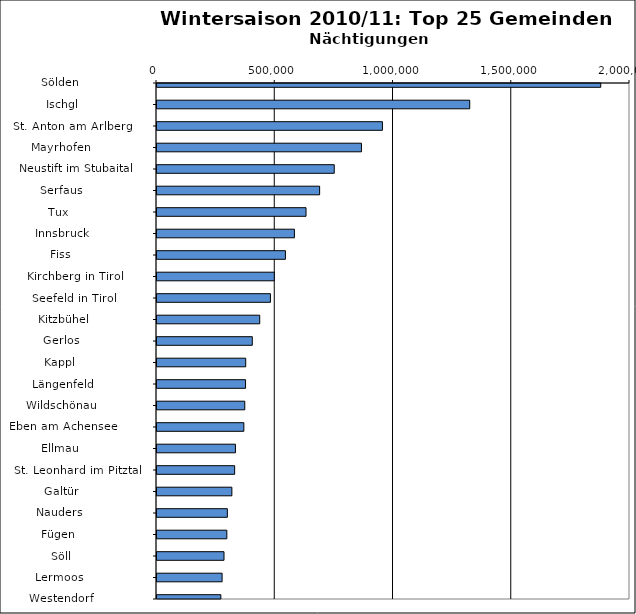
| Category | Series 0 |
|---|---|
|   Sölden                     | 1876366 |
|   Ischgl                     | 1322335 |
|   St. Anton am Arlberg       | 953206 |
|   Mayrhofen                  | 864438 |
|   Neustift im Stubaital      | 749414 |
|   Serfaus                    | 687691 |
|   Tux                        | 630095 |
|   Innsbruck                  | 581081 |
|   Fiss                       | 543073 |
|   Kirchberg in Tirol         | 495938 |
|   Seefeld in Tirol           | 479684 |
|   Kitzbühel                  | 434375 |
|   Gerlos                     | 402967 |
|   Kappl                      | 375075 |
|   Längenfeld                 | 374458 |
|   Wildschönau                | 371196 |
|   Eben am Achensee           | 367223 |
|   Ellmau                     | 331688 |
|   St. Leonhard im Pitztal    | 328293 |
|   Galtür                     | 316561 |
|   Nauders                    | 297533 |
|   Fügen                      | 295322 |
|   Söll                       | 283324 |
|   Lermoos                    | 275263 |
|   Westendorf                 | 269991 |